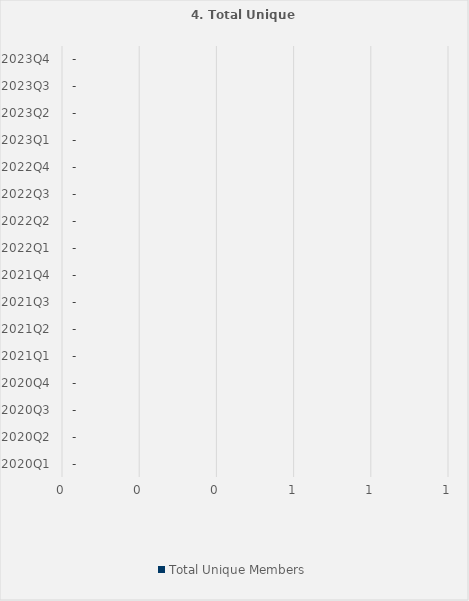
| Category | Total Unique Members |
|---|---|
| 2020Q1 | 0 |
| 2020Q2 | 0 |
| 2020Q3 | 0 |
| 2020Q4 | 0 |
| 2021Q1 | 0 |
| 2021Q2 | 0 |
| 2021Q3 | 0 |
| 2021Q4 | 0 |
| 2022Q1 | 0 |
| 2022Q2 | 0 |
| 2022Q3 | 0 |
| 2022Q4 | 0 |
| 2023Q1 | 0 |
| 2023Q2 | 0 |
| 2023Q3 | 0 |
| 2023Q4 | 0 |